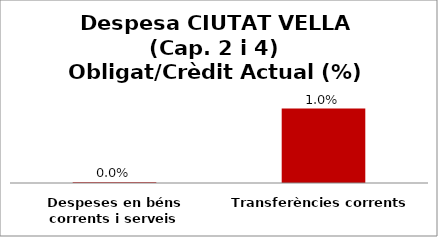
| Category | Series 0 |
|---|---|
| Despeses en béns corrents i serveis | 0 |
| Transferències corrents | 0.01 |